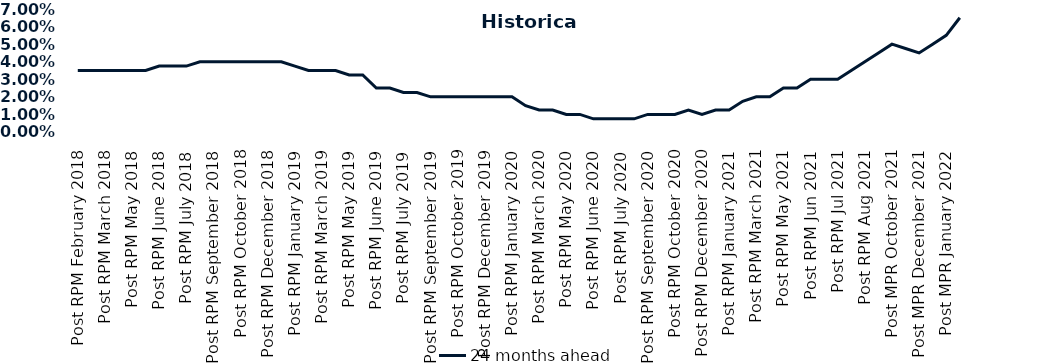
| Category | 24 months ahead |
|---|---|
| Post RPM February 2018 | 0.035 |
| Pre RPM March 2018 | 0.035 |
| Post RPM March 2018 | 0.035 |
| Pre RPM May 2018 | 0.035 |
| Post RPM May 2018 | 0.035 |
| Pre RPM June 2018 | 0.035 |
| Post RPM June 2018 | 0.038 |
| Pre RPM July 2018 | 0.038 |
| Post RPM July 2018 | 0.038 |
| Pre RPM September 2018 | 0.04 |
| Post RPM September 2018 | 0.04 |
| Pre RPM October 2018 | 0.04 |
| Post RPM October 2018 | 0.04 |
| Pre RPM December 2018 | 0.04 |
| Post RPM December 2018 | 0.04 |
| Pre RPM January 2019 | 0.04 |
| Post RPM January 2019 | 0.038 |
| Pre RPM March 2019 | 0.035 |
| Post RPM March 2019 | 0.035 |
| Pre RPM May 2019 | 0.035 |
| Post RPM May 2019 | 0.032 |
| Pre RPM June 2019 | 0.032 |
| Post RPM June 2019 | 0.025 |
| Pre RPM July 2019 | 0.025 |
| Post RPM July 2019 | 0.022 |
| Pre RPM September 2019 | 0.022 |
| Post RPM September 2019 | 0.02 |
| Pre RPM October 2019 | 0.02 |
| Post RPM October 2019 | 0.02 |
| Pre RPM December 2019 | 0.02 |
| Post RPM December 2019 | 0.02 |
| Pre RPM January 2020 | 0.02 |
| Post RPM January 2020 | 0.02 |
| Pre RPM March 2020 | 0.015 |
| Post RPM March 2020 | 0.012 |
| Pre RPM May 2020 | 0.012 |
| Post RPM May 2020 | 0.01 |
| Pre RPM June 2020 | 0.01 |
| Post RPM June 2020 | 0.008 |
| Pre RPM July 2020 | 0.008 |
| Post RPM July 2020 | 0.008 |
| Pre RPM September 2020 | 0.008 |
| Post RPM September 2020 | 0.01 |
| Pre RPM October 2020 | 0.01 |
| Post RPM October 2020 | 0.01 |
| Pre RPM December 2020 | 0.012 |
|  Post RPM December 2020 | 0.01 |
| Pre RPM January 2021 | 0.012 |
| Post RPM January 2021 | 0.012 |
|  Pre RPM March 2021 | 0.018 |
|  Post RPM March 2021 | 0.02 |
|  Pre RPM May 2021 | 0.02 |
|  Post RPM May 2021 | 0.025 |
|  Pre RPM Jun 2021 | 0.025 |
|   Post RPM Jun 2021 | 0.03 |
| Pre RPM Jul 2021 | 0.03 |
|  Post RPM Jul 2021 | 0.03 |
| Pre RPM Aug 2021 | 0.035 |
|  Post RPM Aug 2021 | 0.04 |
| Pre MPR October 2021 | 0.045 |
| Post MPR October 2021 | 0.05 |
| Pre MPR December 2021 | 0.048 |
| Post MPR December 2021 | 0.045 |
| Pre MPR January 2022 | 0.05 |
| Post MPR January 2022 | 0.055 |
| Pre MPR March 2022 | 0.065 |